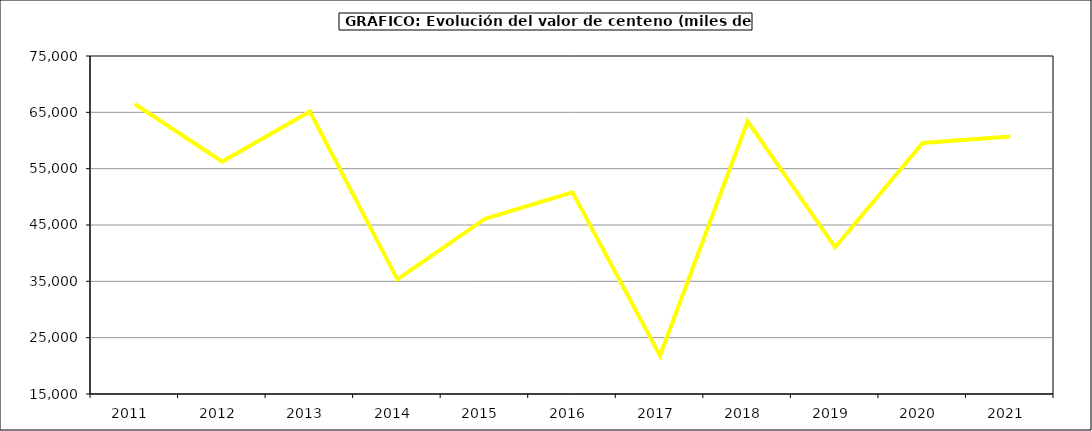
| Category | Valor |
|---|---|
| 2011.0 | 66477.888 |
| 2012.0 | 56263.16 |
| 2013.0 | 65145.46 |
| 2014.0 | 35358 |
| 2015.0 | 46088 |
| 2016.0 | 50792 |
| 2017.0 | 21795.275 |
| 2018.0 | 63397.814 |
| 2019.0 | 41041.209 |
| 2020.0 | 59574.528 |
| 2021.0 | 60710.94 |